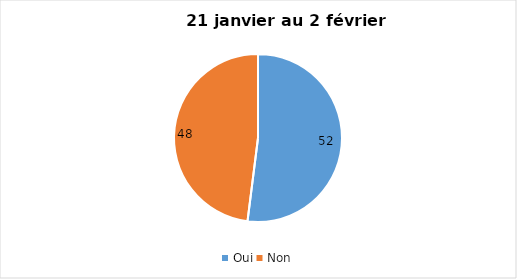
| Category | 21 janvier au 2 février 2022 |
|---|---|
| Oui | 52 |
| Non | 48 |